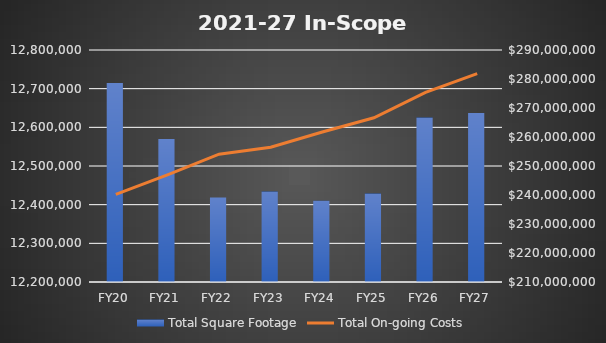
| Category | Total Square Footage |
|---|---|
| FY20 | 12714904.51 |
| FY21 | 12570103.51 |
| FY22 | 12418595.51 |
| FY23 | 12434056.65 |
| FY24 | 12409956.65 |
| FY25 | 12428768.65 |
| FY26 | 12625262.65 |
| FY27 | 12637361.65 |